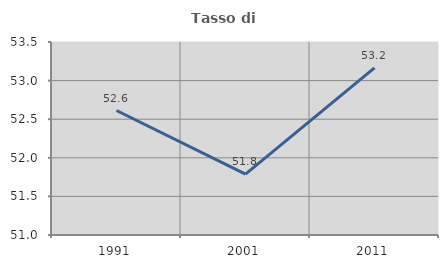
| Category | Tasso di occupazione   |
|---|---|
| 1991.0 | 52.613 |
| 2001.0 | 51.788 |
| 2011.0 | 53.165 |